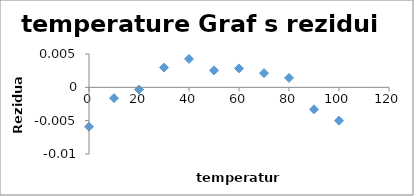
| Category | Series 0 |
|---|---|
| 0.0 | -0.006 |
| 10.0 | -0.002 |
| 20.0 | 0 |
| 30.0 | 0.003 |
| 40.0 | 0.004 |
| 50.0 | 0.003 |
| 60.0 | 0.003 |
| 70.0 | 0.002 |
| 80.0 | 0.001 |
| 90.0 | -0.003 |
| 100.0 | -0.005 |